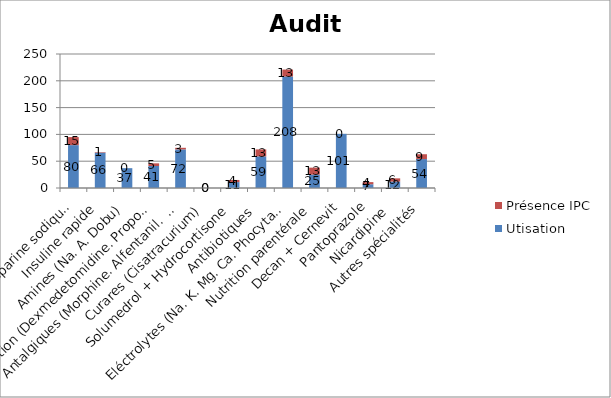
| Category | Utisation | Présence IPC |
|---|---|---|
| Héparine sodique  | 80 | 15 |
| Insuline rapide | 66 | 1 |
| Amines (Na. A. Dobu) | 37 | 0 |
| Sédation (Dexmedetomidine. Propofol. Midazolam) | 41 | 5 |
| Antalgiques (Morphine. Alfentanil.  Sufentanyl. Rémifentanyl. Nefopam) | 72 | 3 |
| Curares (Cisatracurium) | 0 | 0 |
| Solumedrol + Hydrocortisone | 11 | 4 |
| Antibiotiques  | 59 | 13 |
| Eléctrolytes (Na. K. Mg. Ca. Phocytan)  | 208 | 13 |
| Nutrition parentérale | 25 | 13 |
| Decan + Cernevit | 101 | 0 |
| Pantoprazole | 7 | 4 |
| Nicardipine  | 12 | 6 |
| Autres spécialités | 54 | 9 |